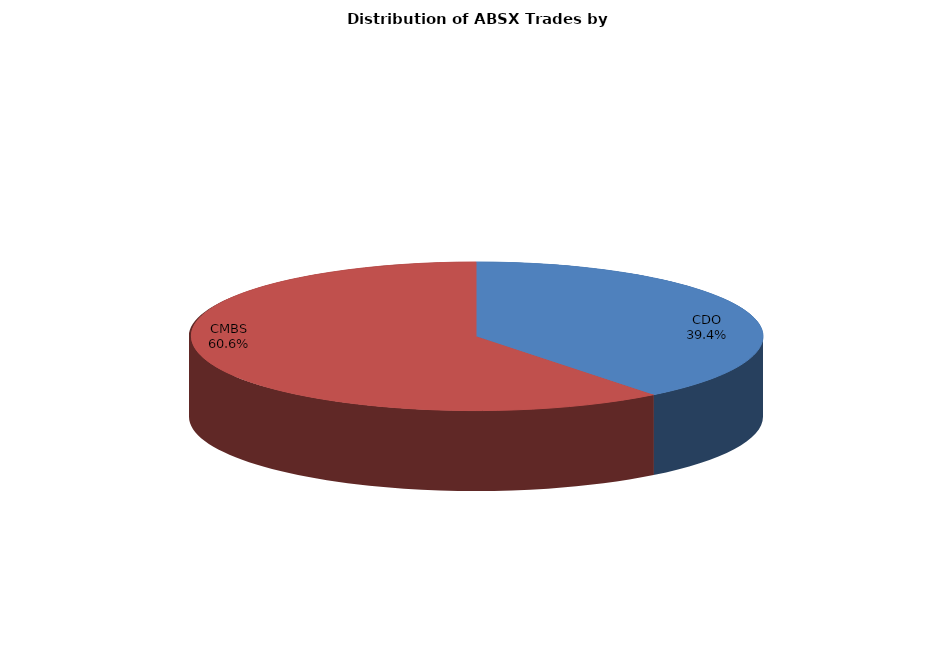
| Category | Series 0 |
|---|---|
| CDO | 136.313 |
| CMBS | 209.794 |